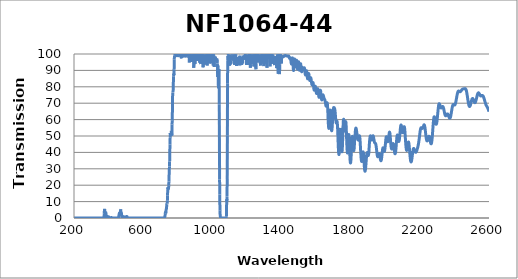
| Category | Transmission (%) |
|---|---|
| 2600.0 | 64.819 |
| 2599.0 | 65.186 |
| 2598.0 | 65.555 |
| 2597.0 | 65.883 |
| 2596.0 | 66.162 |
| 2595.0 | 66.42 |
| 2594.0 | 66.678 |
| 2593.0 | 66.877 |
| 2592.0 | 67.095 |
| 2591.0 | 67.325 |
| 2590.0 | 67.552 |
| 2589.0 | 67.796 |
| 2588.0 | 67.999 |
| 2587.0 | 68.162 |
| 2586.0 | 68.317 |
| 2585.0 | 68.507 |
| 2584.0 | 68.664 |
| 2583.0 | 68.918 |
| 2582.0 | 69.226 |
| 2581.0 | 69.512 |
| 2580.0 | 69.807 |
| 2579.0 | 70.151 |
| 2578.0 | 70.512 |
| 2577.0 | 70.845 |
| 2576.0 | 71.184 |
| 2575.0 | 71.542 |
| 2574.0 | 71.93 |
| 2573.0 | 72.319 |
| 2572.0 | 72.675 |
| 2571.0 | 73.022 |
| 2570.0 | 73.314 |
| 2569.0 | 73.608 |
| 2568.0 | 73.897 |
| 2567.0 | 74.14 |
| 2566.0 | 74.362 |
| 2565.0 | 74.49 |
| 2564.0 | 74.566 |
| 2563.0 | 74.628 |
| 2562.0 | 74.693 |
| 2561.0 | 74.696 |
| 2560.0 | 74.703 |
| 2559.0 | 74.685 |
| 2558.0 | 74.643 |
| 2557.0 | 74.584 |
| 2556.0 | 74.556 |
| 2555.0 | 74.48 |
| 2554.0 | 74.427 |
| 2553.0 | 74.418 |
| 2552.0 | 74.424 |
| 2551.0 | 74.475 |
| 2550.0 | 74.578 |
| 2549.0 | 74.709 |
| 2548.0 | 74.891 |
| 2547.0 | 75.08 |
| 2546.0 | 75.272 |
| 2545.0 | 75.492 |
| 2544.0 | 75.713 |
| 2543.0 | 75.906 |
| 2542.0 | 76.072 |
| 2541.0 | 76.221 |
| 2540.0 | 76.339 |
| 2539.0 | 76.352 |
| 2538.0 | 76.293 |
| 2537.0 | 76.152 |
| 2536.0 | 76.034 |
| 2535.0 | 75.842 |
| 2534.0 | 75.558 |
| 2533.0 | 75.249 |
| 2532.0 | 74.847 |
| 2531.0 | 74.474 |
| 2530.0 | 73.999 |
| 2529.0 | 73.49 |
| 2528.0 | 73.081 |
| 2527.0 | 72.629 |
| 2526.0 | 72.203 |
| 2525.0 | 71.814 |
| 2524.0 | 71.435 |
| 2523.0 | 71.111 |
| 2522.0 | 70.844 |
| 2521.0 | 70.589 |
| 2520.0 | 70.412 |
| 2519.0 | 70.319 |
| 2518.0 | 70.301 |
| 2517.0 | 70.356 |
| 2516.0 | 70.497 |
| 2515.0 | 70.667 |
| 2514.0 | 70.884 |
| 2513.0 | 71.127 |
| 2512.0 | 71.414 |
| 2511.0 | 71.707 |
| 2510.0 | 72.014 |
| 2509.0 | 72.284 |
| 2508.0 | 72.513 |
| 2507.0 | 72.692 |
| 2506.0 | 72.827 |
| 2505.0 | 72.874 |
| 2504.0 | 72.84 |
| 2503.0 | 72.759 |
| 2502.0 | 72.569 |
| 2501.0 | 72.298 |
| 2500.0 | 71.968 |
| 2499.0 | 71.635 |
| 2498.0 | 71.267 |
| 2497.0 | 70.84 |
| 2496.0 | 70.388 |
| 2495.0 | 69.922 |
| 2494.0 | 69.465 |
| 2493.0 | 69.022 |
| 2492.0 | 68.689 |
| 2491.0 | 68.455 |
| 2490.0 | 68.243 |
| 2489.0 | 68.086 |
| 2488.0 | 68.006 |
| 2487.0 | 68.022 |
| 2486.0 | 68.131 |
| 2485.0 | 68.337 |
| 2484.0 | 68.64 |
| 2483.0 | 69.028 |
| 2482.0 | 69.51 |
| 2481.0 | 70.027 |
| 2480.0 | 70.605 |
| 2479.0 | 71.265 |
| 2478.0 | 71.965 |
| 2477.0 | 72.663 |
| 2476.0 | 73.4 |
| 2475.0 | 74.11 |
| 2474.0 | 74.782 |
| 2473.0 | 75.445 |
| 2472.0 | 76.085 |
| 2471.0 | 76.671 |
| 2470.0 | 77.203 |
| 2469.0 | 77.634 |
| 2468.0 | 78 |
| 2467.0 | 78.272 |
| 2466.0 | 78.493 |
| 2465.0 | 78.647 |
| 2464.0 | 78.76 |
| 2463.0 | 78.844 |
| 2462.0 | 78.886 |
| 2461.0 | 78.891 |
| 2460.0 | 78.882 |
| 2459.0 | 78.859 |
| 2458.0 | 78.831 |
| 2457.0 | 78.801 |
| 2456.0 | 78.793 |
| 2455.0 | 78.766 |
| 2454.0 | 78.74 |
| 2453.0 | 78.744 |
| 2452.0 | 78.744 |
| 2451.0 | 78.732 |
| 2450.0 | 78.716 |
| 2449.0 | 78.675 |
| 2448.0 | 78.624 |
| 2447.0 | 78.556 |
| 2446.0 | 78.48 |
| 2445.0 | 78.41 |
| 2444.0 | 78.32 |
| 2443.0 | 78.2 |
| 2442.0 | 78.053 |
| 2441.0 | 77.915 |
| 2440.0 | 77.762 |
| 2439.0 | 77.594 |
| 2438.0 | 77.428 |
| 2437.0 | 77.289 |
| 2436.0 | 77.171 |
| 2435.0 | 77.075 |
| 2434.0 | 77.006 |
| 2433.0 | 76.975 |
| 2432.0 | 76.984 |
| 2431.0 | 77.02 |
| 2430.0 | 77.064 |
| 2429.0 | 77.133 |
| 2428.0 | 77.218 |
| 2427.0 | 77.297 |
| 2426.0 | 77.363 |
| 2425.0 | 77.401 |
| 2424.0 | 77.411 |
| 2423.0 | 77.366 |
| 2422.0 | 77.258 |
| 2421.0 | 77.071 |
| 2420.0 | 76.832 |
| 2419.0 | 76.56 |
| 2418.0 | 76.213 |
| 2417.0 | 75.783 |
| 2416.0 | 75.285 |
| 2415.0 | 74.745 |
| 2414.0 | 74.163 |
| 2413.0 | 73.575 |
| 2412.0 | 72.996 |
| 2411.0 | 72.394 |
| 2410.0 | 71.804 |
| 2409.0 | 71.261 |
| 2408.0 | 70.718 |
| 2407.0 | 70.236 |
| 2406.0 | 69.838 |
| 2405.0 | 69.51 |
| 2404.0 | 69.263 |
| 2403.0 | 69.066 |
| 2402.0 | 68.926 |
| 2401.0 | 68.846 |
| 2400.0 | 68.843 |
| 2399.0 | 68.908 |
| 2398.0 | 69.013 |
| 2397.0 | 69.109 |
| 2396.0 | 69.181 |
| 2395.0 | 69.226 |
| 2394.0 | 69.222 |
| 2393.0 | 69.159 |
| 2392.0 | 69.048 |
| 2391.0 | 68.865 |
| 2390.0 | 68.61 |
| 2389.0 | 68.271 |
| 2388.0 | 67.83 |
| 2387.0 | 67.295 |
| 2386.0 | 66.698 |
| 2385.0 | 66.06 |
| 2384.0 | 65.41 |
| 2383.0 | 64.742 |
| 2382.0 | 64.098 |
| 2381.0 | 63.474 |
| 2380.0 | 62.869 |
| 2379.0 | 62.323 |
| 2378.0 | 61.845 |
| 2377.0 | 61.447 |
| 2376.0 | 61.135 |
| 2375.0 | 60.935 |
| 2374.0 | 60.836 |
| 2373.0 | 60.809 |
| 2372.0 | 60.877 |
| 2371.0 | 61.003 |
| 2370.0 | 61.18 |
| 2369.0 | 61.409 |
| 2368.0 | 61.676 |
| 2367.0 | 61.979 |
| 2366.0 | 62.3 |
| 2365.0 | 62.607 |
| 2364.0 | 62.866 |
| 2363.0 | 63.094 |
| 2362.0 | 63.284 |
| 2361.0 | 63.412 |
| 2360.0 | 63.46 |
| 2359.0 | 63.458 |
| 2358.0 | 63.441 |
| 2357.0 | 63.353 |
| 2356.0 | 63.185 |
| 2355.0 | 63.002 |
| 2354.0 | 62.808 |
| 2353.0 | 62.629 |
| 2352.0 | 62.469 |
| 2351.0 | 62.379 |
| 2350.0 | 62.343 |
| 2349.0 | 62.348 |
| 2348.0 | 62.431 |
| 2347.0 | 62.603 |
| 2346.0 | 62.853 |
| 2345.0 | 63.189 |
| 2344.0 | 63.595 |
| 2343.0 | 64.076 |
| 2342.0 | 64.563 |
| 2341.0 | 65.063 |
| 2340.0 | 65.568 |
| 2339.0 | 66.084 |
| 2338.0 | 66.57 |
| 2337.0 | 66.985 |
| 2336.0 | 67.332 |
| 2335.0 | 67.628 |
| 2334.0 | 67.853 |
| 2333.0 | 67.961 |
| 2332.0 | 68.007 |
| 2331.0 | 67.968 |
| 2330.0 | 67.865 |
| 2329.0 | 67.721 |
| 2328.0 | 67.581 |
| 2327.0 | 67.446 |
| 2326.0 | 67.298 |
| 2325.0 | 67.173 |
| 2324.0 | 67.088 |
| 2323.0 | 67.092 |
| 2322.0 | 67.159 |
| 2321.0 | 67.3 |
| 2320.0 | 67.536 |
| 2319.0 | 67.848 |
| 2318.0 | 68.179 |
| 2317.0 | 68.553 |
| 2316.0 | 68.92 |
| 2315.0 | 69.244 |
| 2314.0 | 69.511 |
| 2313.0 | 69.662 |
| 2312.0 | 69.697 |
| 2311.0 | 69.585 |
| 2310.0 | 69.311 |
| 2309.0 | 68.827 |
| 2308.0 | 68.141 |
| 2307.0 | 67.315 |
| 2306.0 | 66.362 |
| 2305.0 | 65.279 |
| 2304.0 | 64.202 |
| 2303.0 | 63.066 |
| 2302.0 | 61.9 |
| 2301.0 | 60.809 |
| 2300.0 | 59.82 |
| 2299.0 | 58.946 |
| 2298.0 | 58.244 |
| 2297.0 | 57.702 |
| 2296.0 | 57.354 |
| 2295.0 | 57.173 |
| 2294.0 | 57.153 |
| 2293.0 | 57.285 |
| 2292.0 | 57.59 |
| 2291.0 | 58.022 |
| 2290.0 | 58.569 |
| 2289.0 | 59.193 |
| 2288.0 | 59.879 |
| 2287.0 | 60.48 |
| 2286.0 | 60.995 |
| 2285.0 | 61.429 |
| 2284.0 | 61.678 |
| 2283.0 | 61.697 |
| 2282.0 | 61.487 |
| 2281.0 | 61.019 |
| 2280.0 | 60.273 |
| 2279.0 | 59.287 |
| 2278.0 | 58.157 |
| 2277.0 | 56.857 |
| 2276.0 | 55.406 |
| 2275.0 | 53.91 |
| 2274.0 | 52.397 |
| 2273.0 | 50.979 |
| 2272.0 | 49.644 |
| 2271.0 | 48.457 |
| 2270.0 | 47.463 |
| 2269.0 | 46.634 |
| 2268.0 | 45.977 |
| 2267.0 | 45.558 |
| 2266.0 | 45.298 |
| 2265.0 | 45.23 |
| 2264.0 | 45.32 |
| 2263.0 | 45.573 |
| 2262.0 | 45.948 |
| 2261.0 | 46.405 |
| 2260.0 | 46.931 |
| 2259.0 | 47.506 |
| 2258.0 | 48.061 |
| 2257.0 | 48.597 |
| 2256.0 | 49.051 |
| 2255.0 | 49.42 |
| 2254.0 | 49.707 |
| 2253.0 | 49.852 |
| 2252.0 | 49.83 |
| 2251.0 | 49.704 |
| 2250.0 | 49.469 |
| 2249.0 | 49.146 |
| 2248.0 | 48.754 |
| 2247.0 | 48.34 |
| 2246.0 | 47.924 |
| 2245.0 | 47.582 |
| 2244.0 | 47.323 |
| 2243.0 | 47.099 |
| 2242.0 | 46.997 |
| 2241.0 | 47.035 |
| 2240.0 | 47.222 |
| 2239.0 | 47.569 |
| 2238.0 | 48.023 |
| 2237.0 | 48.679 |
| 2236.0 | 49.476 |
| 2235.0 | 50.312 |
| 2234.0 | 51.22 |
| 2233.0 | 52.176 |
| 2232.0 | 53.073 |
| 2231.0 | 54.026 |
| 2230.0 | 54.828 |
| 2229.0 | 55.519 |
| 2228.0 | 56.086 |
| 2227.0 | 56.477 |
| 2226.0 | 56.724 |
| 2225.0 | 56.844 |
| 2224.0 | 56.798 |
| 2223.0 | 56.605 |
| 2222.0 | 56.346 |
| 2221.0 | 56.024 |
| 2220.0 | 55.695 |
| 2219.0 | 55.371 |
| 2218.0 | 55.112 |
| 2217.0 | 54.858 |
| 2216.0 | 54.754 |
| 2215.0 | 54.658 |
| 2214.0 | 54.632 |
| 2213.0 | 54.667 |
| 2212.0 | 54.758 |
| 2211.0 | 54.882 |
| 2210.0 | 55.009 |
| 2209.0 | 55.094 |
| 2208.0 | 55.105 |
| 2207.0 | 55.017 |
| 2206.0 | 54.839 |
| 2205.0 | 54.577 |
| 2204.0 | 54.155 |
| 2203.0 | 53.618 |
| 2202.0 | 53.015 |
| 2201.0 | 52.262 |
| 2200.0 | 51.461 |
| 2199.0 | 50.591 |
| 2198.0 | 49.739 |
| 2197.0 | 48.84 |
| 2196.0 | 48.033 |
| 2195.0 | 47.205 |
| 2194.0 | 46.493 |
| 2193.0 | 45.817 |
| 2192.0 | 45.204 |
| 2191.0 | 44.623 |
| 2190.0 | 44.103 |
| 2189.0 | 43.623 |
| 2188.0 | 43.174 |
| 2187.0 | 42.755 |
| 2186.0 | 42.382 |
| 2185.0 | 42.061 |
| 2184.0 | 41.732 |
| 2183.0 | 41.391 |
| 2182.0 | 41.083 |
| 2181.0 | 40.806 |
| 2180.0 | 40.563 |
| 2179.0 | 40.363 |
| 2178.0 | 40.196 |
| 2177.0 | 40.067 |
| 2176.0 | 40.04 |
| 2175.0 | 40.05 |
| 2174.0 | 40.118 |
| 2173.0 | 40.238 |
| 2172.0 | 40.445 |
| 2171.0 | 40.729 |
| 2170.0 | 41.052 |
| 2169.0 | 41.364 |
| 2168.0 | 41.678 |
| 2167.0 | 41.944 |
| 2166.0 | 42.181 |
| 2165.0 | 42.373 |
| 2164.0 | 42.398 |
| 2163.0 | 42.271 |
| 2162.0 | 41.985 |
| 2161.0 | 41.537 |
| 2160.0 | 40.943 |
| 2159.0 | 40.245 |
| 2158.0 | 39.477 |
| 2157.0 | 38.59 |
| 2156.0 | 37.696 |
| 2155.0 | 36.844 |
| 2154.0 | 36.078 |
| 2153.0 | 35.374 |
| 2152.0 | 34.837 |
| 2151.0 | 34.429 |
| 2150.0 | 34.226 |
| 2149.0 | 34.2 |
| 2148.0 | 34.363 |
| 2147.0 | 34.743 |
| 2146.0 | 35.36 |
| 2145.0 | 36.143 |
| 2144.0 | 37.094 |
| 2143.0 | 38.211 |
| 2142.0 | 39.443 |
| 2141.0 | 40.74 |
| 2140.0 | 42.123 |
| 2139.0 | 43.321 |
| 2138.0 | 44.391 |
| 2137.0 | 45.266 |
| 2136.0 | 45.914 |
| 2135.0 | 46.28 |
| 2134.0 | 46.306 |
| 2133.0 | 46.081 |
| 2132.0 | 45.608 |
| 2131.0 | 44.975 |
| 2130.0 | 44.256 |
| 2129.0 | 43.469 |
| 2128.0 | 42.725 |
| 2127.0 | 42.079 |
| 2126.0 | 41.594 |
| 2125.0 | 41.308 |
| 2124.0 | 41.211 |
| 2123.0 | 41.386 |
| 2122.0 | 41.839 |
| 2121.0 | 42.53 |
| 2120.0 | 43.474 |
| 2119.0 | 44.659 |
| 2118.0 | 46.052 |
| 2117.0 | 47.633 |
| 2116.0 | 49.203 |
| 2115.0 | 50.813 |
| 2114.0 | 52.321 |
| 2113.0 | 53.642 |
| 2112.0 | 54.704 |
| 2111.0 | 55.366 |
| 2110.0 | 55.663 |
| 2109.0 | 55.633 |
| 2108.0 | 55.317 |
| 2107.0 | 54.817 |
| 2106.0 | 54.199 |
| 2105.0 | 53.516 |
| 2104.0 | 52.905 |
| 2103.0 | 52.424 |
| 2102.0 | 52.135 |
| 2101.0 | 52.025 |
| 2100.0 | 52.146 |
| 2099.0 | 52.506 |
| 2098.0 | 53.049 |
| 2097.0 | 53.71 |
| 2096.0 | 54.446 |
| 2095.0 | 55.178 |
| 2094.0 | 55.862 |
| 2093.0 | 56.403 |
| 2092.0 | 56.687 |
| 2091.0 | 56.698 |
| 2090.0 | 56.391 |
| 2089.0 | 55.823 |
| 2088.0 | 54.984 |
| 2087.0 | 53.927 |
| 2086.0 | 52.704 |
| 2085.0 | 51.425 |
| 2084.0 | 50.184 |
| 2083.0 | 49.05 |
| 2082.0 | 48.121 |
| 2081.0 | 47.385 |
| 2080.0 | 46.882 |
| 2079.0 | 46.67 |
| 2078.0 | 46.727 |
| 2077.0 | 46.991 |
| 2076.0 | 47.467 |
| 2075.0 | 48.101 |
| 2074.0 | 48.814 |
| 2073.0 | 49.532 |
| 2072.0 | 50.151 |
| 2071.0 | 50.529 |
| 2070.0 | 50.618 |
| 2069.0 | 50.373 |
| 2068.0 | 49.785 |
| 2067.0 | 48.915 |
| 2066.0 | 47.788 |
| 2065.0 | 46.452 |
| 2064.0 | 45.064 |
| 2063.0 | 43.687 |
| 2062.0 | 42.407 |
| 2061.0 | 41.323 |
| 2060.0 | 40.404 |
| 2059.0 | 39.714 |
| 2058.0 | 39.309 |
| 2057.0 | 39.164 |
| 2056.0 | 39.233 |
| 2055.0 | 39.529 |
| 2054.0 | 40.042 |
| 2053.0 | 40.74 |
| 2052.0 | 41.546 |
| 2051.0 | 42.396 |
| 2050.0 | 43.26 |
| 2049.0 | 44.075 |
| 2048.0 | 44.756 |
| 2047.0 | 45.183 |
| 2046.0 | 45.373 |
| 2045.0 | 45.317 |
| 2044.0 | 45.044 |
| 2043.0 | 44.602 |
| 2042.0 | 44.056 |
| 2041.0 | 43.457 |
| 2040.0 | 42.877 |
| 2039.0 | 42.407 |
| 2038.0 | 42.134 |
| 2037.0 | 42.07 |
| 2036.0 | 42.229 |
| 2035.0 | 42.654 |
| 2034.0 | 43.407 |
| 2033.0 | 44.365 |
| 2032.0 | 45.485 |
| 2031.0 | 46.776 |
| 2030.0 | 48.163 |
| 2029.0 | 49.521 |
| 2028.0 | 50.666 |
| 2027.0 | 51.564 |
| 2026.0 | 52.142 |
| 2025.0 | 52.378 |
| 2024.0 | 52.232 |
| 2023.0 | 51.72 |
| 2022.0 | 50.959 |
| 2021.0 | 50.064 |
| 2020.0 | 49.136 |
| 2019.0 | 48.27 |
| 2018.0 | 47.51 |
| 2017.0 | 46.925 |
| 2016.0 | 46.591 |
| 2015.0 | 46.493 |
| 2014.0 | 46.585 |
| 2013.0 | 46.872 |
| 2012.0 | 47.363 |
| 2011.0 | 47.936 |
| 2010.0 | 48.498 |
| 2009.0 | 49.026 |
| 2008.0 | 49.409 |
| 2007.0 | 49.563 |
| 2006.0 | 49.472 |
| 2005.0 | 49.11 |
| 2004.0 | 48.437 |
| 2003.0 | 47.496 |
| 2002.0 | 46.39 |
| 2001.0 | 45.203 |
| 2000.0 | 44.028 |
| 1999.0 | 42.994 |
| 1998.0 | 42.089 |
| 1997.0 | 41.349 |
| 1996.0 | 40.872 |
| 1995.0 | 40.657 |
| 1994.0 | 40.677 |
| 1993.0 | 40.871 |
| 1992.0 | 41.212 |
| 1991.0 | 41.647 |
| 1990.0 | 42.101 |
| 1989.0 | 42.507 |
| 1988.0 | 42.748 |
| 1987.0 | 42.785 |
| 1986.0 | 42.569 |
| 1985.0 | 42.089 |
| 1984.0 | 41.373 |
| 1983.0 | 40.477 |
| 1982.0 | 39.48 |
| 1981.0 | 38.451 |
| 1980.0 | 37.474 |
| 1979.0 | 36.602 |
| 1978.0 | 35.887 |
| 1977.0 | 35.356 |
| 1976.0 | 35.031 |
| 1975.0 | 34.907 |
| 1974.0 | 34.984 |
| 1973.0 | 35.251 |
| 1972.0 | 35.692 |
| 1971.0 | 36.23 |
| 1970.0 | 36.853 |
| 1969.0 | 37.543 |
| 1968.0 | 38.186 |
| 1967.0 | 38.691 |
| 1966.0 | 39.081 |
| 1965.0 | 39.305 |
| 1964.0 | 39.312 |
| 1963.0 | 39.128 |
| 1962.0 | 38.839 |
| 1961.0 | 38.483 |
| 1960.0 | 38.096 |
| 1959.0 | 37.761 |
| 1958.0 | 37.494 |
| 1957.0 | 37.352 |
| 1956.0 | 37.388 |
| 1955.0 | 37.641 |
| 1954.0 | 38.116 |
| 1953.0 | 38.765 |
| 1952.0 | 39.555 |
| 1951.0 | 40.463 |
| 1950.0 | 41.405 |
| 1949.0 | 42.395 |
| 1948.0 | 43.29 |
| 1947.0 | 44.03 |
| 1946.0 | 44.625 |
| 1945.0 | 45.104 |
| 1944.0 | 45.387 |
| 1943.0 | 45.541 |
| 1942.0 | 45.632 |
| 1941.0 | 45.685 |
| 1940.0 | 45.746 |
| 1939.0 | 45.855 |
| 1938.0 | 46.1 |
| 1937.0 | 46.467 |
| 1936.0 | 46.965 |
| 1935.0 | 47.565 |
| 1934.0 | 48.212 |
| 1933.0 | 48.843 |
| 1932.0 | 49.426 |
| 1931.0 | 49.893 |
| 1930.0 | 50.146 |
| 1929.0 | 50.15 |
| 1928.0 | 50.006 |
| 1927.0 | 49.693 |
| 1926.0 | 49.246 |
| 1925.0 | 48.76 |
| 1924.0 | 48.316 |
| 1923.0 | 47.929 |
| 1922.0 | 47.622 |
| 1921.0 | 47.496 |
| 1920.0 | 47.574 |
| 1919.0 | 47.83 |
| 1918.0 | 48.297 |
| 1917.0 | 48.886 |
| 1916.0 | 49.488 |
| 1915.0 | 49.95 |
| 1914.0 | 50.134 |
| 1913.0 | 49.932 |
| 1912.0 | 49.351 |
| 1911.0 | 48.535 |
| 1910.0 | 47.563 |
| 1909.0 | 46.385 |
| 1908.0 | 44.963 |
| 1907.0 | 43.269 |
| 1906.0 | 41.473 |
| 1905.0 | 40.005 |
| 1904.0 | 38.984 |
| 1903.0 | 38.363 |
| 1902.0 | 38.103 |
| 1901.0 | 38.058 |
| 1900.0 | 38.253 |
| 1899.0 | 38.566 |
| 1898.0 | 38.936 |
| 1897.0 | 39.393 |
| 1896.0 | 39.751 |
| 1895.0 | 39.902 |
| 1894.0 | 39.718 |
| 1893.0 | 39.113 |
| 1892.0 | 37.954 |
| 1891.0 | 36.584 |
| 1890.0 | 35.138 |
| 1889.0 | 33.636 |
| 1888.0 | 32.341 |
| 1887.0 | 31.189 |
| 1886.0 | 30.175 |
| 1885.0 | 29.281 |
| 1884.0 | 28.68 |
| 1883.0 | 28.493 |
| 1882.0 | 28.692 |
| 1881.0 | 29.311 |
| 1880.0 | 30.289 |
| 1879.0 | 31.529 |
| 1878.0 | 33.203 |
| 1877.0 | 34.893 |
| 1876.0 | 36.587 |
| 1875.0 | 38.166 |
| 1874.0 | 39.424 |
| 1873.0 | 40.089 |
| 1872.0 | 40.334 |
| 1871.0 | 40.049 |
| 1870.0 | 39.191 |
| 1869.0 | 38.099 |
| 1868.0 | 36.932 |
| 1867.0 | 35.939 |
| 1866.0 | 35.167 |
| 1865.0 | 34.691 |
| 1864.0 | 34.477 |
| 1863.0 | 34.582 |
| 1862.0 | 35.106 |
| 1861.0 | 35.957 |
| 1860.0 | 37.185 |
| 1859.0 | 38.779 |
| 1858.0 | 40.508 |
| 1857.0 | 42.438 |
| 1856.0 | 44.419 |
| 1855.0 | 46.245 |
| 1854.0 | 47.848 |
| 1853.0 | 48.962 |
| 1852.0 | 49.752 |
| 1851.0 | 50.12 |
| 1850.0 | 50.13 |
| 1849.0 | 49.779 |
| 1848.0 | 49.006 |
| 1847.0 | 48.173 |
| 1846.0 | 47.657 |
| 1845.0 | 47.439 |
| 1844.0 | 47.491 |
| 1843.0 | 47.726 |
| 1842.0 | 48.037 |
| 1841.0 | 48.227 |
| 1840.0 | 48.658 |
| 1839.0 | 49.287 |
| 1838.0 | 50.05 |
| 1837.0 | 50.916 |
| 1836.0 | 51.724 |
| 1835.0 | 52.469 |
| 1834.0 | 53.185 |
| 1833.0 | 53.835 |
| 1832.0 | 54.443 |
| 1831.0 | 54.73 |
| 1830.0 | 54.792 |
| 1829.0 | 54.52 |
| 1828.0 | 53.93 |
| 1827.0 | 52.884 |
| 1826.0 | 51.468 |
| 1825.0 | 50.067 |
| 1824.0 | 48.608 |
| 1823.0 | 47.092 |
| 1822.0 | 45.327 |
| 1821.0 | 43.524 |
| 1820.0 | 42.103 |
| 1819.0 | 41.336 |
| 1818.0 | 41.1 |
| 1817.0 | 41.306 |
| 1816.0 | 41.89 |
| 1815.0 | 42.831 |
| 1814.0 | 44.053 |
| 1813.0 | 45.535 |
| 1812.0 | 47.145 |
| 1811.0 | 48.531 |
| 1810.0 | 49.499 |
| 1809.0 | 49.767 |
| 1808.0 | 49.209 |
| 1807.0 | 47.814 |
| 1806.0 | 45.675 |
| 1805.0 | 43.204 |
| 1804.0 | 40.66 |
| 1803.0 | 38.307 |
| 1802.0 | 36.269 |
| 1801.0 | 34.816 |
| 1800.0 | 33.836 |
| 1799.0 | 33.52 |
| 1798.0 | 33.877 |
| 1797.0 | 34.934 |
| 1796.0 | 36.567 |
| 1795.0 | 38.819 |
| 1794.0 | 41.548 |
| 1793.0 | 44.456 |
| 1792.0 | 47.331 |
| 1791.0 | 49.507 |
| 1790.0 | 50.735 |
| 1789.0 | 50.776 |
| 1788.0 | 49.69 |
| 1787.0 | 47.856 |
| 1786.0 | 45.599 |
| 1785.0 | 43.425 |
| 1784.0 | 41.451 |
| 1783.0 | 40.26 |
| 1782.0 | 39.671 |
| 1781.0 | 39.803 |
| 1780.0 | 40.695 |
| 1779.0 | 42.294 |
| 1778.0 | 44.582 |
| 1777.0 | 47.245 |
| 1776.0 | 50.251 |
| 1775.0 | 53.277 |
| 1774.0 | 55.905 |
| 1773.0 | 57.732 |
| 1772.0 | 58.665 |
| 1771.0 | 58.635 |
| 1770.0 | 57.812 |
| 1769.0 | 56.5 |
| 1768.0 | 55.094 |
| 1767.0 | 53.926 |
| 1766.0 | 53.19 |
| 1765.0 | 53.126 |
| 1764.0 | 53.752 |
| 1763.0 | 55.022 |
| 1762.0 | 56.646 |
| 1761.0 | 58.359 |
| 1760.0 | 59.76 |
| 1759.0 | 60.243 |
| 1758.0 | 59.661 |
| 1757.0 | 57.939 |
| 1756.0 | 55.247 |
| 1755.0 | 51.901 |
| 1754.0 | 48.527 |
| 1753.0 | 45.48 |
| 1752.0 | 42.989 |
| 1751.0 | 41.334 |
| 1750.0 | 40.457 |
| 1749.0 | 40.456 |
| 1748.0 | 41.299 |
| 1747.0 | 42.898 |
| 1746.0 | 45.196 |
| 1745.0 | 47.865 |
| 1744.0 | 50.707 |
| 1743.0 | 53.093 |
| 1742.0 | 54.603 |
| 1741.0 | 54.92 |
| 1740.0 | 53.906 |
| 1739.0 | 51.846 |
| 1738.0 | 49.146 |
| 1737.0 | 46.256 |
| 1736.0 | 43.597 |
| 1735.0 | 41.374 |
| 1734.0 | 39.776 |
| 1733.0 | 38.879 |
| 1732.0 | 38.735 |
| 1731.0 | 39.246 |
| 1730.0 | 40.45 |
| 1729.0 | 42.324 |
| 1728.0 | 44.744 |
| 1727.0 | 47.553 |
| 1726.0 | 50.552 |
| 1725.0 | 53.349 |
| 1724.0 | 55.795 |
| 1723.0 | 57.589 |
| 1722.0 | 58.642 |
| 1721.0 | 58.979 |
| 1720.0 | 58.822 |
| 1719.0 | 58.416 |
| 1718.0 | 58.012 |
| 1717.0 | 57.847 |
| 1716.0 | 58.057 |
| 1715.0 | 58.675 |
| 1714.0 | 59.641 |
| 1713.0 | 60.842 |
| 1712.0 | 62.212 |
| 1711.0 | 63.533 |
| 1710.0 | 64.732 |
| 1709.0 | 65.697 |
| 1708.0 | 66.364 |
| 1707.0 | 66.787 |
| 1706.0 | 67.034 |
| 1705.0 | 67.19 |
| 1704.0 | 67.288 |
| 1703.0 | 67.363 |
| 1702.0 | 67.352 |
| 1701.0 | 67.157 |
| 1700.0 | 66.676 |
| 1699.0 | 65.815 |
| 1698.0 | 64.532 |
| 1697.0 | 62.904 |
| 1696.0 | 61.011 |
| 1695.0 | 58.979 |
| 1694.0 | 57.02 |
| 1693.0 | 55.325 |
| 1692.0 | 54.104 |
| 1691.0 | 53.361 |
| 1690.0 | 53.21 |
| 1689.0 | 53.714 |
| 1688.0 | 54.869 |
| 1687.0 | 56.601 |
| 1686.0 | 58.764 |
| 1685.0 | 61.079 |
| 1684.0 | 63.252 |
| 1683.0 | 64.904 |
| 1682.0 | 65.752 |
| 1681.0 | 65.622 |
| 1680.0 | 64.488 |
| 1679.0 | 62.658 |
| 1678.0 | 60.437 |
| 1677.0 | 58.258 |
| 1676.0 | 56.422 |
| 1675.0 | 55.172 |
| 1674.0 | 54.641 |
| 1673.0 | 54.87 |
| 1672.0 | 55.824 |
| 1671.0 | 57.416 |
| 1670.0 | 59.56 |
| 1669.0 | 62.096 |
| 1668.0 | 64.651 |
| 1667.0 | 66.86 |
| 1666.0 | 68.645 |
| 1665.0 | 69.772 |
| 1664.0 | 70.255 |
| 1663.0 | 70.161 |
| 1662.0 | 69.71 |
| 1661.0 | 69.127 |
| 1660.0 | 68.588 |
| 1659.0 | 68.248 |
| 1658.0 | 68.18 |
| 1657.0 | 68.39 |
| 1656.0 | 68.867 |
| 1655.0 | 69.523 |
| 1654.0 | 70.218 |
| 1653.0 | 70.873 |
| 1652.0 | 71.442 |
| 1651.0 | 71.888 |
| 1650.0 | 72.17 |
| 1649.0 | 72.362 |
| 1648.0 | 72.523 |
| 1647.0 | 72.725 |
| 1646.0 | 72.997 |
| 1645.0 | 73.36 |
| 1644.0 | 73.81 |
| 1643.0 | 74.271 |
| 1642.0 | 74.674 |
| 1641.0 | 74.962 |
| 1640.0 | 75.057 |
| 1639.0 | 74.88 |
| 1638.0 | 74.434 |
| 1637.0 | 73.805 |
| 1636.0 | 73.121 |
| 1635.0 | 72.515 |
| 1634.0 | 72.112 |
| 1633.0 | 72.02 |
| 1632.0 | 72.267 |
| 1631.0 | 72.853 |
| 1630.0 | 73.747 |
| 1629.0 | 74.815 |
| 1628.0 | 75.915 |
| 1627.0 | 76.918 |
| 1626.0 | 77.627 |
| 1625.0 | 77.912 |
| 1624.0 | 77.773 |
| 1623.0 | 77.265 |
| 1622.0 | 76.468 |
| 1621.0 | 75.543 |
| 1620.0 | 74.665 |
| 1619.0 | 73.977 |
| 1618.0 | 73.602 |
| 1617.0 | 73.599 |
| 1616.0 | 73.97 |
| 1615.0 | 74.662 |
| 1614.0 | 75.574 |
| 1613.0 | 76.589 |
| 1612.0 | 77.545 |
| 1611.0 | 78.298 |
| 1610.0 | 78.752 |
| 1609.0 | 78.855 |
| 1608.0 | 78.589 |
| 1607.0 | 78.027 |
| 1606.0 | 77.361 |
| 1605.0 | 76.695 |
| 1604.0 | 76.161 |
| 1603.0 | 75.916 |
| 1602.0 | 75.999 |
| 1601.0 | 76.451 |
| 1600.0 | 77.177 |
| 1599.0 | 78.073 |
| 1598.0 | 78.974 |
| 1597.0 | 79.727 |
| 1596.0 | 80.215 |
| 1595.0 | 80.323 |
| 1594.0 | 80.089 |
| 1593.0 | 79.573 |
| 1592.0 | 78.95 |
| 1591.0 | 78.376 |
| 1590.0 | 78.014 |
| 1589.0 | 77.972 |
| 1588.0 | 78.274 |
| 1587.0 | 78.939 |
| 1586.0 | 79.829 |
| 1585.0 | 80.782 |
| 1584.0 | 81.675 |
| 1583.0 | 82.287 |
| 1582.0 | 82.594 |
| 1581.0 | 82.583 |
| 1580.0 | 82.3 |
| 1579.0 | 81.902 |
| 1578.0 | 81.494 |
| 1577.0 | 81.255 |
| 1576.0 | 81.306 |
| 1575.0 | 81.687 |
| 1574.0 | 82.337 |
| 1573.0 | 83.197 |
| 1572.0 | 84.076 |
| 1571.0 | 84.856 |
| 1570.0 | 85.384 |
| 1569.0 | 85.563 |
| 1568.0 | 85.403 |
| 1567.0 | 84.995 |
| 1566.0 | 84.463 |
| 1565.0 | 84.035 |
| 1564.0 | 83.842 |
| 1563.0 | 83.974 |
| 1562.0 | 84.493 |
| 1561.0 | 85.326 |
| 1560.0 | 86.297 |
| 1559.0 | 87.243 |
| 1558.0 | 87.917 |
| 1557.0 | 88.105 |
| 1556.0 | 87.859 |
| 1555.0 | 87.193 |
| 1554.0 | 86.351 |
| 1553.0 | 85.519 |
| 1552.0 | 84.967 |
| 1551.0 | 84.863 |
| 1550.0 | 85.262 |
| 1549.0 | 86.073 |
| 1548.0 | 87.131 |
| 1547.0 | 88.255 |
| 1546.0 | 89.178 |
| 1545.0 | 89.721 |
| 1544.0 | 89.777 |
| 1543.0 | 89.376 |
| 1542.0 | 88.686 |
| 1541.0 | 87.928 |
| 1540.0 | 87.356 |
| 1539.0 | 87.139 |
| 1538.0 | 87.33 |
| 1537.0 | 87.944 |
| 1536.0 | 88.812 |
| 1535.0 | 89.808 |
| 1534.0 | 90.693 |
| 1533.0 | 91.316 |
| 1532.0 | 91.576 |
| 1531.0 | 91.481 |
| 1530.0 | 91.177 |
| 1529.0 | 90.761 |
| 1528.0 | 90.433 |
| 1527.0 | 90.291 |
| 1526.0 | 90.433 |
| 1525.0 | 90.784 |
| 1524.0 | 91.237 |
| 1523.0 | 91.596 |
| 1522.0 | 91.708 |
| 1521.0 | 91.477 |
| 1520.0 | 90.925 |
| 1519.0 | 90.214 |
| 1518.0 | 89.534 |
| 1517.0 | 89.204 |
| 1516.0 | 89.29 |
| 1515.0 | 89.882 |
| 1514.0 | 90.876 |
| 1513.0 | 92.159 |
| 1512.0 | 93.238 |
| 1511.0 | 93.954 |
| 1510.0 | 94.096 |
| 1509.0 | 93.586 |
| 1508.0 | 92.688 |
| 1507.0 | 91.488 |
| 1506.0 | 90.572 |
| 1505.0 | 90.061 |
| 1504.0 | 90.181 |
| 1503.0 | 90.914 |
| 1502.0 | 92.063 |
| 1501.0 | 93.43 |
| 1500.0 | 94.586 |
| 1499.0 | 95.208 |
| 1498.0 | 95.15 |
| 1497.0 | 94.425 |
| 1496.0 | 93.294 |
| 1495.0 | 92.08 |
| 1494.0 | 91.157 |
| 1493.0 | 90.741 |
| 1492.0 | 90.919 |
| 1491.0 | 91.775 |
| 1490.0 | 93.037 |
| 1489.0 | 94.455 |
| 1488.0 | 95.607 |
| 1487.0 | 96.201 |
| 1486.0 | 96.099 |
| 1485.0 | 95.298 |
| 1484.0 | 94.168 |
| 1483.0 | 93.079 |
| 1482.0 | 92.356 |
| 1481.0 | 92.264 |
| 1480.0 | 92.871 |
| 1479.0 | 94.003 |
| 1478.0 | 95.347 |
| 1477.0 | 96.452 |
| 1476.0 | 96.941 |
| 1475.0 | 96.581 |
| 1474.0 | 95.384 |
| 1473.0 | 93.7 |
| 1472.0 | 92.016 |
| 1471.0 | 90.617 |
| 1470.0 | 89.948 |
| 1469.0 | 90.252 |
| 1468.0 | 91.319 |
| 1467.0 | 93.029 |
| 1466.0 | 94.785 |
| 1465.0 | 96.367 |
| 1464.0 | 97.382 |
| 1463.0 | 97.618 |
| 1462.0 | 97.151 |
| 1461.0 | 96.283 |
| 1460.0 | 95.25 |
| 1459.0 | 94.4 |
| 1458.0 | 93.904 |
| 1457.0 | 94.024 |
| 1456.0 | 94.503 |
| 1455.0 | 95.268 |
| 1454.0 | 96.127 |
| 1453.0 | 96.876 |
| 1452.0 | 97.448 |
| 1451.0 | 97.688 |
| 1450.0 | 97.733 |
| 1449.0 | 97.614 |
| 1448.0 | 97.44 |
| 1447.0 | 97.344 |
| 1446.0 | 97.455 |
| 1445.0 | 97.713 |
| 1444.0 | 98.06 |
| 1443.0 | 98.38 |
| 1442.0 | 98.684 |
| 1441.0 | 98.833 |
| 1440.0 | 98.827 |
| 1439.0 | 98.829 |
| 1438.0 | 98.711 |
| 1437.0 | 98.656 |
| 1436.0 | 98.632 |
| 1435.0 | 98.703 |
| 1434.0 | 98.786 |
| 1433.0 | 98.85 |
| 1432.0 | 98.876 |
| 1431.0 | 98.907 |
| 1430.0 | 98.878 |
| 1429.0 | 98.848 |
| 1428.0 | 98.847 |
| 1427.0 | 98.891 |
| 1426.0 | 98.914 |
| 1425.0 | 98.992 |
| 1424.0 | 99.025 |
| 1423.0 | 99.064 |
| 1422.0 | 99.061 |
| 1421.0 | 99.055 |
| 1420.0 | 99.03 |
| 1419.0 | 98.922 |
| 1418.0 | 98.927 |
| 1417.0 | 98.921 |
| 1416.0 | 98.894 |
| 1415.0 | 98.794 |
| 1414.0 | 98.723 |
| 1413.0 | 98.527 |
| 1412.0 | 98.446 |
| 1411.0 | 98.346 |
| 1410.0 | 98.263 |
| 1409.0 | 98.302 |
| 1408.0 | 98.313 |
| 1407.0 | 98.339 |
| 1406.0 | 98.356 |
| 1405.0 | 98.316 |
| 1404.0 | 98.303 |
| 1403.0 | 98.296 |
| 1402.0 | 98.135 |
| 1401.0 | 97.921 |
| 1400.0 | 95.159 |
| 1399.0 | 94.216 |
| 1398.0 | 99.574 |
| 1397.0 | 99.254 |
| 1396.0 | 97.972 |
| 1395.0 | 95.397 |
| 1394.0 | 95.071 |
| 1393.0 | 100 |
| 1392.0 | 97.748 |
| 1391.0 | 98.811 |
| 1390.0 | 93.768 |
| 1389.0 | 89.222 |
| 1388.0 | 87.731 |
| 1387.0 | 89.371 |
| 1386.0 | 93.649 |
| 1385.0 | 99.001 |
| 1384.0 | 99.832 |
| 1383.0 | 98.227 |
| 1382.0 | 93.32 |
| 1381.0 | 88.001 |
| 1380.0 | 93.11 |
| 1379.0 | 95.975 |
| 1378.0 | 97.266 |
| 1377.0 | 99.56 |
| 1376.0 | 99.748 |
| 1375.0 | 99.08 |
| 1374.0 | 96.814 |
| 1373.0 | 94.229 |
| 1372.0 | 91.379 |
| 1371.0 | 92.403 |
| 1370.0 | 94.017 |
| 1369.0 | 95.165 |
| 1368.0 | 98.76 |
| 1367.0 | 96.071 |
| 1366.0 | 97.812 |
| 1365.0 | 97.225 |
| 1364.0 | 98.336 |
| 1363.0 | 98.642 |
| 1362.0 | 96.951 |
| 1361.0 | 98.028 |
| 1360.0 | 93.231 |
| 1359.0 | 93.71 |
| 1358.0 | 97.167 |
| 1357.0 | 95.88 |
| 1356.0 | 96.651 |
| 1355.0 | 97.09 |
| 1354.0 | 94.153 |
| 1353.0 | 95.01 |
| 1352.0 | 98.959 |
| 1351.0 | 99.657 |
| 1350.0 | 99.433 |
| 1349.0 | 99.268 |
| 1348.0 | 99.23 |
| 1347.0 | 99.81 |
| 1346.0 | 99.337 |
| 1345.0 | 99.913 |
| 1344.0 | 98.405 |
| 1343.0 | 94.225 |
| 1342.0 | 99.861 |
| 1341.0 | 99.922 |
| 1340.0 | 99.441 |
| 1339.0 | 98.339 |
| 1338.0 | 99.432 |
| 1337.0 | 99.932 |
| 1336.0 | 93.889 |
| 1335.0 | 92.971 |
| 1334.0 | 92.466 |
| 1333.0 | 93.519 |
| 1332.0 | 99.857 |
| 1331.0 | 97.088 |
| 1330.0 | 96.669 |
| 1329.0 | 98.885 |
| 1328.0 | 97.809 |
| 1327.0 | 99.969 |
| 1326.0 | 99.427 |
| 1325.0 | 98.967 |
| 1324.0 | 99.681 |
| 1323.0 | 99.444 |
| 1322.0 | 99.422 |
| 1321.0 | 98.446 |
| 1320.0 | 99.739 |
| 1319.0 | 98.721 |
| 1318.0 | 96.679 |
| 1317.0 | 92.712 |
| 1316.0 | 91.606 |
| 1315.0 | 93.197 |
| 1314.0 | 96.323 |
| 1313.0 | 99.218 |
| 1312.0 | 98.254 |
| 1311.0 | 98.768 |
| 1310.0 | 99.866 |
| 1309.0 | 98.61 |
| 1308.0 | 94.473 |
| 1307.0 | 94.009 |
| 1306.0 | 99.639 |
| 1305.0 | 98.877 |
| 1304.0 | 99.477 |
| 1303.0 | 99.163 |
| 1302.0 | 99.458 |
| 1301.0 | 99.663 |
| 1300.0 | 99.69 |
| 1299.0 | 94.462 |
| 1298.0 | 92.619 |
| 1297.0 | 94.739 |
| 1296.0 | 99.14 |
| 1295.0 | 98.27 |
| 1294.0 | 98.41 |
| 1293.0 | 98.847 |
| 1292.0 | 98.871 |
| 1291.0 | 94.259 |
| 1290.0 | 94.874 |
| 1289.0 | 99.856 |
| 1288.0 | 97.594 |
| 1287.0 | 98.493 |
| 1286.0 | 99.797 |
| 1285.0 | 98.572 |
| 1284.0 | 99.385 |
| 1283.0 | 98.559 |
| 1282.0 | 97.757 |
| 1281.0 | 99.278 |
| 1280.0 | 96.598 |
| 1279.0 | 92.971 |
| 1278.0 | 93.589 |
| 1277.0 | 95.492 |
| 1276.0 | 99.504 |
| 1275.0 | 98.775 |
| 1274.0 | 98.93 |
| 1273.0 | 99.2 |
| 1272.0 | 97.867 |
| 1271.0 | 99.367 |
| 1270.0 | 99.129 |
| 1269.0 | 99.648 |
| 1268.0 | 97.946 |
| 1267.0 | 98.688 |
| 1266.0 | 96.84 |
| 1265.0 | 94.821 |
| 1264.0 | 98.619 |
| 1263.0 | 98.475 |
| 1262.0 | 99.845 |
| 1261.0 | 98.467 |
| 1260.0 | 98.654 |
| 1259.0 | 99.812 |
| 1258.0 | 99.563 |
| 1257.0 | 99.646 |
| 1256.0 | 99.578 |
| 1255.0 | 99.95 |
| 1254.0 | 98.495 |
| 1253.0 | 95.413 |
| 1252.0 | 90.684 |
| 1251.0 | 91.095 |
| 1250.0 | 95.778 |
| 1249.0 | 98.369 |
| 1248.0 | 98.102 |
| 1247.0 | 99.371 |
| 1246.0 | 99.904 |
| 1245.0 | 99.735 |
| 1244.0 | 99.935 |
| 1243.0 | 99.546 |
| 1242.0 | 97.774 |
| 1241.0 | 93.581 |
| 1240.0 | 92.426 |
| 1239.0 | 95.017 |
| 1238.0 | 99.779 |
| 1237.0 | 99.182 |
| 1236.0 | 98.64 |
| 1235.0 | 97.853 |
| 1234.0 | 98.043 |
| 1233.0 | 99.243 |
| 1232.0 | 98.481 |
| 1231.0 | 97.843 |
| 1230.0 | 98.194 |
| 1229.0 | 98.813 |
| 1228.0 | 96.912 |
| 1227.0 | 94.096 |
| 1226.0 | 96.587 |
| 1225.0 | 99.183 |
| 1224.0 | 98.749 |
| 1223.0 | 99.107 |
| 1222.0 | 98.26 |
| 1221.0 | 93.507 |
| 1220.0 | 91.636 |
| 1219.0 | 95.667 |
| 1218.0 | 99.887 |
| 1217.0 | 99.461 |
| 1216.0 | 98.955 |
| 1215.0 | 99.676 |
| 1214.0 | 99.985 |
| 1213.0 | 99.233 |
| 1212.0 | 99.763 |
| 1211.0 | 99.445 |
| 1210.0 | 96.89 |
| 1209.0 | 98.876 |
| 1208.0 | 95.73 |
| 1207.0 | 96.481 |
| 1206.0 | 97.453 |
| 1205.0 | 97.892 |
| 1204.0 | 93.383 |
| 1203.0 | 94.641 |
| 1202.0 | 98.844 |
| 1201.0 | 99.428 |
| 1200.0 | 98.678 |
| 1199.0 | 96.95 |
| 1198.0 | 93.302 |
| 1197.0 | 96.868 |
| 1196.0 | 99.415 |
| 1195.0 | 99.861 |
| 1194.0 | 99.806 |
| 1193.0 | 99.55 |
| 1192.0 | 99.393 |
| 1191.0 | 99.94 |
| 1190.0 | 97.047 |
| 1189.0 | 96.838 |
| 1188.0 | 99.001 |
| 1187.0 | 97.916 |
| 1186.0 | 96.467 |
| 1185.0 | 97.667 |
| 1184.0 | 98.322 |
| 1183.0 | 98.139 |
| 1182.0 | 97.104 |
| 1181.0 | 97.409 |
| 1180.0 | 98.953 |
| 1179.0 | 98.919 |
| 1178.0 | 98.522 |
| 1177.0 | 97.627 |
| 1176.0 | 94.164 |
| 1175.0 | 94.455 |
| 1174.0 | 95.985 |
| 1173.0 | 96.249 |
| 1172.0 | 98.163 |
| 1171.0 | 95.846 |
| 1170.0 | 93.31 |
| 1169.0 | 93.374 |
| 1168.0 | 94.334 |
| 1167.0 | 95.494 |
| 1166.0 | 95.941 |
| 1165.0 | 97.079 |
| 1164.0 | 95.856 |
| 1163.0 | 94.779 |
| 1162.0 | 96.146 |
| 1161.0 | 97.709 |
| 1160.0 | 98.966 |
| 1159.0 | 98.961 |
| 1158.0 | 96.522 |
| 1157.0 | 93.059 |
| 1156.0 | 95.482 |
| 1155.0 | 96.997 |
| 1154.0 | 98.268 |
| 1153.0 | 95.712 |
| 1152.0 | 94.455 |
| 1151.0 | 94.887 |
| 1150.0 | 95.558 |
| 1149.0 | 95.593 |
| 1148.0 | 95.263 |
| 1147.0 | 96.574 |
| 1146.0 | 98.188 |
| 1145.0 | 94.876 |
| 1144.0 | 95.439 |
| 1143.0 | 96.097 |
| 1142.0 | 96.021 |
| 1141.0 | 96.911 |
| 1140.0 | 92.752 |
| 1139.0 | 93.904 |
| 1138.0 | 95.367 |
| 1137.0 | 97.324 |
| 1136.0 | 98.061 |
| 1135.0 | 99.756 |
| 1134.0 | 97.532 |
| 1133.0 | 97.178 |
| 1132.0 | 97.62 |
| 1131.0 | 97.475 |
| 1130.0 | 95.505 |
| 1129.0 | 93.341 |
| 1128.0 | 99.749 |
| 1127.0 | 95.76 |
| 1126.0 | 94.144 |
| 1125.0 | 95.427 |
| 1124.0 | 97.821 |
| 1123.0 | 97.739 |
| 1122.0 | 97.683 |
| 1121.0 | 98.256 |
| 1120.0 | 98.181 |
| 1119.0 | 96.9 |
| 1118.0 | 96.058 |
| 1117.0 | 96.878 |
| 1116.0 | 97.17 |
| 1115.0 | 98.93 |
| 1114.0 | 99.766 |
| 1113.0 | 99.118 |
| 1112.0 | 97.985 |
| 1111.0 | 96.634 |
| 1110.0 | 96.76 |
| 1109.0 | 98.066 |
| 1108.0 | 96.259 |
| 1107.0 | 95.994 |
| 1106.0 | 95.062 |
| 1105.0 | 94.173 |
| 1104.0 | 93.986 |
| 1103.0 | 94.801 |
| 1102.0 | 97.209 |
| 1101.0 | 98.045 |
| 1100.0 | 99.153 |
| 1099.0 | 94.899 |
| 1098.0 | 92.868 |
| 1097.0 | 99.706 |
| 1096.0 | 95.238 |
| 1095.0 | 95.735 |
| 1094.0 | 97.59 |
| 1093.0 | 97.874 |
| 1092.0 | 98.241 |
| 1091.0 | 99.201 |
| 1090.0 | 98.977 |
| 1089.0 | 96.013 |
| 1088.0 | 81.838 |
| 1087.0 | 50.186 |
| 1086.0 | 23.766 |
| 1085.0 | 13.056 |
| 1084.0 | 10.488 |
| 1083.0 | 11.436 |
| 1082.0 | 0.984 |
| 1081.0 | 0.622 |
| 1080.0 | 0.041 |
| 1079.0 | 0.011 |
| 1078.0 | 0.002 |
| 1077.0 | 0 |
| 1076.0 | 0 |
| 1075.0 | 0 |
| 1074.0 | 0 |
| 1073.0 | 0 |
| 1072.0 | 0 |
| 1071.0 | 0 |
| 1070.0 | 0 |
| 1069.0 | 0 |
| 1068.0 | 0 |
| 1067.0 | 0 |
| 1066.0 | 0 |
| 1065.0 | 0 |
| 1064.0 | 0 |
| 1063.0 | 0 |
| 1062.0 | 0 |
| 1061.0 | 0 |
| 1060.0 | 0 |
| 1059.0 | 0 |
| 1058.0 | 0 |
| 1057.0 | 0 |
| 1056.0 | 0 |
| 1055.0 | 0 |
| 1054.0 | 0.001 |
| 1053.0 | 0.001 |
| 1052.0 | 0.003 |
| 1051.0 | 0.009 |
| 1050.0 | 0.023 |
| 1049.0 | 0.036 |
| 1048.0 | 0.066 |
| 1047.0 | 0.37 |
| 1046.0 | 1.235 |
| 1045.0 | 2.274 |
| 1044.0 | 4.482 |
| 1043.0 | 14.31 |
| 1042.0 | 23.491 |
| 1041.0 | 47.003 |
| 1040.0 | 69.017 |
| 1039.0 | 85.745 |
| 1038.0 | 90.757 |
| 1037.0 | 84.948 |
| 1036.0 | 79.108 |
| 1035.0 | 80.353 |
| 1034.0 | 89.8 |
| 1033.0 | 91.732 |
| 1032.0 | 92.967 |
| 1031.0 | 85.958 |
| 1030.0 | 91.375 |
| 1029.0 | 94.205 |
| 1028.0 | 96.625 |
| 1027.0 | 97.089 |
| 1026.0 | 97.072 |
| 1025.0 | 95.347 |
| 1024.0 | 96.031 |
| 1023.0 | 96.419 |
| 1022.0 | 96.791 |
| 1021.0 | 97.388 |
| 1020.0 | 96.455 |
| 1019.0 | 97.657 |
| 1018.0 | 97.904 |
| 1017.0 | 96.447 |
| 1016.0 | 98.47 |
| 1015.0 | 95.961 |
| 1014.0 | 98.258 |
| 1013.0 | 98.288 |
| 1012.0 | 96.42 |
| 1011.0 | 92.034 |
| 1010.0 | 98.283 |
| 1009.0 | 98.792 |
| 1008.0 | 99.233 |
| 1007.0 | 99.437 |
| 1006.0 | 99.732 |
| 1005.0 | 92.987 |
| 1004.0 | 98.244 |
| 1003.0 | 99.266 |
| 1002.0 | 99.452 |
| 1001.0 | 99.315 |
| 1000.0 | 99.171 |
| 999.0 | 96.007 |
| 998.0 | 98.96 |
| 997.0 | 99.656 |
| 996.0 | 98.259 |
| 995.0 | 94.401 |
| 994.0 | 98.925 |
| 993.0 | 98.602 |
| 992.0 | 98.649 |
| 991.0 | 99.863 |
| 990.0 | 94.913 |
| 989.0 | 96.501 |
| 988.0 | 99.241 |
| 987.0 | 99.119 |
| 986.0 | 98.812 |
| 985.0 | 94.153 |
| 984.0 | 98.367 |
| 983.0 | 99.315 |
| 982.0 | 99.295 |
| 981.0 | 94.975 |
| 980.0 | 99.973 |
| 979.0 | 98.324 |
| 978.0 | 99.483 |
| 977.0 | 94.512 |
| 976.0 | 96.915 |
| 975.0 | 99.325 |
| 974.0 | 95.619 |
| 973.0 | 98.399 |
| 972.0 | 99.792 |
| 971.0 | 98.259 |
| 970.0 | 92.964 |
| 969.0 | 97.686 |
| 968.0 | 99.127 |
| 967.0 | 99.562 |
| 966.0 | 99.62 |
| 965.0 | 99.402 |
| 964.0 | 94.179 |
| 963.0 | 94.697 |
| 962.0 | 98.006 |
| 961.0 | 94.261 |
| 960.0 | 99.572 |
| 959.0 | 93.586 |
| 958.0 | 94.085 |
| 957.0 | 99.212 |
| 956.0 | 94.593 |
| 955.0 | 99.732 |
| 954.0 | 94.621 |
| 953.0 | 98.868 |
| 952.0 | 99.165 |
| 951.0 | 95.993 |
| 950.0 | 99.593 |
| 949.0 | 95.952 |
| 948.0 | 99.023 |
| 947.0 | 92.03 |
| 946.0 | 91.837 |
| 945.0 | 98.785 |
| 944.0 | 99.304 |
| 943.0 | 98.786 |
| 942.0 | 99.814 |
| 941.0 | 98.237 |
| 940.0 | 94.669 |
| 939.0 | 98.577 |
| 938.0 | 99.893 |
| 937.0 | 99.249 |
| 936.0 | 96.463 |
| 935.0 | 99.633 |
| 934.0 | 98.491 |
| 933.0 | 97.365 |
| 932.0 | 93.992 |
| 931.0 | 94.249 |
| 930.0 | 99.773 |
| 929.0 | 98.049 |
| 928.0 | 99.681 |
| 927.0 | 94.817 |
| 926.0 | 95.33 |
| 925.0 | 99.358 |
| 924.0 | 98.414 |
| 923.0 | 99.185 |
| 922.0 | 99.063 |
| 921.0 | 95.908 |
| 920.0 | 98.462 |
| 919.0 | 99.254 |
| 918.0 | 98.785 |
| 917.0 | 99.906 |
| 916.0 | 98.284 |
| 915.0 | 95.811 |
| 914.0 | 97.541 |
| 913.0 | 96.999 |
| 912.0 | 95.803 |
| 911.0 | 98.986 |
| 910.0 | 98.789 |
| 909.0 | 99.478 |
| 908.0 | 99.837 |
| 907.0 | 99.283 |
| 906.0 | 98.843 |
| 905.0 | 98.4 |
| 904.0 | 97.271 |
| 903.0 | 99.186 |
| 902.0 | 99.543 |
| 901.0 | 97.485 |
| 900.0 | 93.988 |
| 899.0 | 97.612 |
| 898.0 | 99.703 |
| 897.0 | 98.879 |
| 896.0 | 99.549 |
| 895.0 | 99.938 |
| 894.0 | 97.049 |
| 893.0 | 91.557 |
| 892.0 | 94.51 |
| 891.0 | 98.969 |
| 890.0 | 98.9 |
| 889.0 | 99.73 |
| 888.0 | 99.852 |
| 887.0 | 98.561 |
| 886.0 | 97.589 |
| 885.0 | 96.878 |
| 884.0 | 96.176 |
| 883.0 | 99.052 |
| 882.0 | 99.803 |
| 881.0 | 99.239 |
| 880.0 | 98.478 |
| 879.0 | 97.507 |
| 878.0 | 98.798 |
| 877.0 | 99.591 |
| 876.0 | 98.467 |
| 875.0 | 95.173 |
| 874.0 | 97.219 |
| 873.0 | 98.886 |
| 872.0 | 98.173 |
| 871.0 | 98.898 |
| 870.0 | 99.464 |
| 869.0 | 99.639 |
| 868.0 | 96.067 |
| 867.0 | 94.832 |
| 866.0 | 97.126 |
| 865.0 | 99.052 |
| 864.0 | 99.793 |
| 863.0 | 99.329 |
| 862.0 | 99.173 |
| 861.0 | 99.096 |
| 860.0 | 98.5 |
| 859.0 | 98.682 |
| 858.0 | 98.69 |
| 857.0 | 99.155 |
| 856.0 | 99.374 |
| 855.0 | 99.553 |
| 854.0 | 98.759 |
| 853.0 | 99.334 |
| 852.0 | 99.453 |
| 851.0 | 99.086 |
| 850.0 | 99.635 |
| 849.0 | 99.429 |
| 848.0 | 98.93 |
| 847.0 | 98.705 |
| 846.0 | 98.795 |
| 845.0 | 98.674 |
| 844.0 | 98.979 |
| 843.0 | 98.999 |
| 842.0 | 99.23 |
| 841.0 | 99.576 |
| 840.0 | 98.954 |
| 839.0 | 98.969 |
| 838.0 | 99.281 |
| 837.0 | 98.706 |
| 836.0 | 98.935 |
| 835.0 | 98.895 |
| 834.0 | 98.773 |
| 833.0 | 98.913 |
| 832.0 | 98.763 |
| 831.0 | 98.962 |
| 830.0 | 99.219 |
| 829.0 | 99.115 |
| 828.0 | 98.838 |
| 827.0 | 98.407 |
| 826.0 | 98.306 |
| 825.0 | 98.6 |
| 824.0 | 99.223 |
| 823.0 | 99.885 |
| 822.0 | 99.888 |
| 821.0 | 99.354 |
| 820.0 | 98.255 |
| 819.0 | 97.977 |
| 818.0 | 98.692 |
| 817.0 | 99.148 |
| 816.0 | 99.194 |
| 815.0 | 99.271 |
| 814.0 | 99.574 |
| 813.0 | 98.679 |
| 812.0 | 99.011 |
| 811.0 | 99.615 |
| 810.0 | 99.606 |
| 809.0 | 99.332 |
| 808.0 | 99.313 |
| 807.0 | 99.42 |
| 806.0 | 99.238 |
| 805.0 | 99.029 |
| 804.0 | 99.148 |
| 803.0 | 99.028 |
| 802.0 | 98.917 |
| 801.0 | 99.079 |
| 800.0 | 99.254 |
| 799.0 | 99.078 |
| 798.0 | 99.122 |
| 797.0 | 99.107 |
| 796.0 | 99.039 |
| 795.0 | 99.081 |
| 794.0 | 99.074 |
| 793.0 | 99.022 |
| 792.0 | 99.044 |
| 791.0 | 99.008 |
| 790.0 | 98.966 |
| 789.0 | 99.019 |
| 788.0 | 99.088 |
| 787.0 | 99.09 |
| 786.0 | 99.161 |
| 785.0 | 99.17 |
| 784.0 | 99.09 |
| 783.0 | 99.152 |
| 782.0 | 99.217 |
| 781.0 | 98.878 |
| 780.0 | 96.491 |
| 779.0 | 90.761 |
| 778.0 | 87.205 |
| 777.0 | 87.994 |
| 776.0 | 86.475 |
| 775.0 | 83.895 |
| 774.0 | 80.498 |
| 773.0 | 76.642 |
| 772.0 | 76.636 |
| 771.0 | 76.376 |
| 770.0 | 73.183 |
| 769.0 | 64.672 |
| 768.0 | 59.227 |
| 767.0 | 56.962 |
| 766.0 | 50.236 |
| 765.0 | 50.82 |
| 764.0 | 52.649 |
| 763.0 | 53.084 |
| 762.0 | 52.162 |
| 761.0 | 50.266 |
| 760.0 | 51.377 |
| 759.0 | 50.903 |
| 758.0 | 50.44 |
| 757.0 | 51.834 |
| 756.0 | 48.956 |
| 755.0 | 44.806 |
| 754.0 | 39.768 |
| 753.0 | 34.397 |
| 752.0 | 31.424 |
| 751.0 | 28.974 |
| 750.0 | 25.95 |
| 749.0 | 22.26 |
| 748.0 | 19.916 |
| 747.0 | 18.46 |
| 746.0 | 17.775 |
| 745.0 | 18.007 |
| 744.0 | 18.205 |
| 743.0 | 18.734 |
| 742.0 | 17.151 |
| 741.0 | 13.822 |
| 740.0 | 10.577 |
| 739.0 | 8.717 |
| 738.0 | 8.558 |
| 737.0 | 8.417 |
| 736.0 | 7.313 |
| 735.0 | 6.089 |
| 734.0 | 5.544 |
| 733.0 | 5.184 |
| 732.0 | 3.904 |
| 731.0 | 2.693 |
| 730.0 | 2.819 |
| 729.0 | 3.435 |
| 728.0 | 3.002 |
| 727.0 | 1.812 |
| 726.0 | 1.075 |
| 725.0 | 0.762 |
| 724.0 | 0.498 |
| 723.0 | 0.346 |
| 722.0 | 0.232 |
| 721.0 | 0.11 |
| 720.0 | 0.044 |
| 719.0 | 0.018 |
| 718.0 | 0.006 |
| 717.0 | 0.001 |
| 716.0 | 0.003 |
| 715.0 | 0.004 |
| 714.0 | 0.003 |
| 713.0 | 0.002 |
| 712.0 | 0.006 |
| 711.0 | 0.005 |
| 710.0 | 0.002 |
| 709.0 | 0.005 |
| 708.0 | 0.003 |
| 707.0 | 0.001 |
| 706.0 | 0.006 |
| 705.0 | 0.004 |
| 704.0 | 0.006 |
| 703.0 | 0.003 |
| 702.0 | 0.002 |
| 701.0 | 0.001 |
| 700.0 | 0.005 |
| 699.0 | 0.004 |
| 698.0 | 0.005 |
| 697.0 | 0.004 |
| 696.0 | 0.002 |
| 695.0 | 0.001 |
| 694.0 | 0.006 |
| 693.0 | 0.004 |
| 692.0 | 0.006 |
| 691.0 | 0.005 |
| 690.0 | 0.002 |
| 689.0 | 0.004 |
| 688.0 | 0.005 |
| 687.0 | 0.005 |
| 686.0 | 0.005 |
| 685.0 | 0.003 |
| 684.0 | 0.003 |
| 683.0 | 0.001 |
| 682.0 | 0.007 |
| 681.0 | 0.006 |
| 680.0 | 0.006 |
| 679.0 | 0.004 |
| 678.0 | 0.002 |
| 677.0 | 0.003 |
| 676.0 | 0.006 |
| 675.0 | 0.004 |
| 674.0 | 0.008 |
| 673.0 | 0.005 |
| 672.0 | 0.004 |
| 671.0 | 0.002 |
| 670.0 | 0.007 |
| 669.0 | 0.005 |
| 668.0 | 0.005 |
| 667.0 | 0.003 |
| 666.0 | 0.003 |
| 665.0 | 0.001 |
| 664.0 | 0.007 |
| 663.0 | 0.006 |
| 662.0 | 0.006 |
| 661.0 | 0.006 |
| 660.0 | 0.002 |
| 659.0 | 0.003 |
| 658.0 | 0.007 |
| 657.0 | 0.006 |
| 656.0 | 0.007 |
| 655.0 | 0.006 |
| 654.0 | 0.003 |
| 653.0 | 0.002 |
| 652.0 | 0.005 |
| 651.0 | 0.006 |
| 650.0 | 0.006 |
| 649.0 | 0.006 |
| 648.0 | 0.002 |
| 647.0 | 0.003 |
| 646.0 | 0.005 |
| 645.0 | 0.005 |
| 644.0 | 0.007 |
| 643.0 | 0.007 |
| 642.0 | 0.002 |
| 641.0 | 0.004 |
| 640.0 | 0.006 |
| 639.0 | 0.008 |
| 638.0 | 0.005 |
| 637.0 | 0.005 |
| 636.0 | 0.002 |
| 635.0 | 0.003 |
| 634.0 | 0.005 |
| 633.0 | 0.006 |
| 632.0 | 0.006 |
| 631.0 | 0.006 |
| 630.0 | 0.001 |
| 629.0 | 0.004 |
| 628.0 | 0.005 |
| 627.0 | 0.006 |
| 626.0 | 0.005 |
| 625.0 | 0.007 |
| 624.0 | 0.002 |
| 623.0 | 0.004 |
| 622.0 | 0.006 |
| 621.0 | 0.006 |
| 620.0 | 0.006 |
| 619.0 | 0.007 |
| 618.0 | 0.003 |
| 617.0 | 0.005 |
| 616.0 | 0.006 |
| 615.0 | 0.006 |
| 614.0 | 0.006 |
| 613.0 | 0.005 |
| 612.0 | 0.002 |
| 611.0 | 0.003 |
| 610.0 | 0.006 |
| 609.0 | 0.007 |
| 608.0 | 0.008 |
| 607.0 | 0.006 |
| 606.0 | 0.003 |
| 605.0 | 0.003 |
| 604.0 | 0.006 |
| 603.0 | 0.006 |
| 602.0 | 0.007 |
| 601.0 | 0.006 |
| 600.0 | 0.003 |
| 599.0 | 0.004 |
| 598.0 | 0.006 |
| 597.0 | 0.005 |
| 596.0 | 0.004 |
| 595.0 | 0.006 |
| 594.0 | 0.003 |
| 593.0 | 0.004 |
| 592.0 | 0.006 |
| 591.0 | 0.007 |
| 590.0 | 0.007 |
| 589.0 | 0.006 |
| 588.0 | 0.003 |
| 587.0 | 0.002 |
| 586.0 | 0.006 |
| 585.0 | 0.006 |
| 584.0 | 0.005 |
| 583.0 | 0.006 |
| 582.0 | 0.003 |
| 581.0 | 0.003 |
| 580.0 | 0.006 |
| 579.0 | 0.007 |
| 578.0 | 0.007 |
| 577.0 | 0.005 |
| 576.0 | 0.004 |
| 575.0 | 0.003 |
| 574.0 | 0.008 |
| 573.0 | 0.007 |
| 572.0 | 0.007 |
| 571.0 | 0.005 |
| 570.0 | 0.003 |
| 569.0 | 0.003 |
| 568.0 | 0.006 |
| 567.0 | 0.006 |
| 566.0 | 0.005 |
| 565.0 | 0.006 |
| 564.0 | 0.003 |
| 563.0 | 0.004 |
| 562.0 | 0.007 |
| 561.0 | 0.007 |
| 560.0 | 0.006 |
| 559.0 | 0.005 |
| 558.0 | 0.007 |
| 557.0 | 0.005 |
| 556.0 | 0.003 |
| 555.0 | 0.004 |
| 554.0 | 0.007 |
| 553.0 | 0.005 |
| 552.0 | 0.005 |
| 551.0 | 0.004 |
| 550.0 | 0.003 |
| 549.0 | 0.004 |
| 548.0 | 0.007 |
| 547.0 | 0.007 |
| 546.0 | 0.007 |
| 545.0 | 0.006 |
| 544.0 | 0.004 |
| 543.0 | 0.005 |
| 542.0 | 0.007 |
| 541.0 | 0.006 |
| 540.0 | 0.007 |
| 539.0 | 0.006 |
| 538.0 | 0.003 |
| 537.0 | 0.004 |
| 536.0 | 0.007 |
| 535.0 | 0.007 |
| 534.0 | 0.008 |
| 533.0 | 0.006 |
| 532.0 | 0.003 |
| 531.0 | 0.004 |
| 530.0 | 0.006 |
| 529.0 | 0.007 |
| 528.0 | 0.007 |
| 527.0 | 0.006 |
| 526.0 | 0.003 |
| 525.0 | 0.005 |
| 524.0 | 0.007 |
| 523.0 | 0.007 |
| 522.0 | 0.006 |
| 521.0 | 0.005 |
| 520.0 | 0.003 |
| 519.0 | 0.004 |
| 518.0 | 0.003 |
| 517.0 | 0.005 |
| 516.0 | 0.014 |
| 515.0 | 0.013 |
| 514.0 | 0.01 |
| 513.0 | 0.005 |
| 512.0 | 0.001 |
| 511.0 | 0.003 |
| 510.0 | 0.019 |
| 509.0 | 0.125 |
| 508.0 | 0.436 |
| 507.0 | 0.802 |
| 506.0 | 0.86 |
| 505.0 | 0.611 |
| 504.0 | 0.509 |
| 503.0 | 0.72 |
| 502.0 | 0.846 |
| 501.0 | 0.631 |
| 500.0 | 0.328 |
| 499.0 | 0.207 |
| 498.0 | 0.296 |
| 497.0 | 0.467 |
| 496.0 | 0.53 |
| 495.0 | 0.44 |
| 494.0 | 0.289 |
| 493.0 | 0.163 |
| 492.0 | 0.1 |
| 491.0 | 0.091 |
| 490.0 | 0.145 |
| 489.0 | 0.368 |
| 488.0 | 0.696 |
| 487.0 | 0.795 |
| 486.0 | 0.639 |
| 485.0 | 0.624 |
| 484.0 | 0.803 |
| 483.0 | 0.797 |
| 482.0 | 0.679 |
| 481.0 | 0.858 |
| 480.0 | 1.157 |
| 479.0 | 1.069 |
| 478.0 | 0.718 |
| 477.0 | 0.66 |
| 476.0 | 1.226 |
| 475.0 | 2.294 |
| 474.0 | 3.176 |
| 473.0 | 3.327 |
| 472.0 | 3.33 |
| 471.0 | 4.177 |
| 470.0 | 5.346 |
| 469.0 | 5.006 |
| 468.0 | 3.044 |
| 467.0 | 1.466 |
| 466.0 | 1.292 |
| 465.0 | 1.96 |
| 464.0 | 2.744 |
| 463.0 | 3.054 |
| 462.0 | 2.802 |
| 461.0 | 2.282 |
| 460.0 | 1.69 |
| 459.0 | 1.135 |
| 458.0 | 0.622 |
| 457.0 | 0.253 |
| 456.0 | 0.129 |
| 455.0 | 0.119 |
| 454.0 | 0.09 |
| 453.0 | 0.037 |
| 452.0 | 0.002 |
| 451.0 | 0.006 |
| 450.0 | 0.006 |
| 449.0 | 0.003 |
| 448.0 | 0 |
| 447.0 | 0.003 |
| 446.0 | 0.005 |
| 445.0 | 0.005 |
| 444.0 | 0.006 |
| 443.0 | 0.004 |
| 442.0 | 0.003 |
| 441.0 | 0.006 |
| 440.0 | 0.007 |
| 439.0 | 0.006 |
| 438.0 | 0.007 |
| 437.0 | 0.005 |
| 436.0 | 0.002 |
| 435.0 | 0.005 |
| 434.0 | 0.006 |
| 433.0 | 0.006 |
| 432.0 | 0.007 |
| 431.0 | 0.004 |
| 430.0 | 0.003 |
| 429.0 | 0.004 |
| 428.0 | 0.005 |
| 427.0 | 0.005 |
| 426.0 | 0.005 |
| 425.0 | 0 |
| 424.0 | 0.023 |
| 423.0 | 0.047 |
| 422.0 | 0.037 |
| 421.0 | 0.011 |
| 420.0 | 0.004 |
| 419.0 | 0.015 |
| 418.0 | 0.152 |
| 417.0 | 0.3 |
| 416.0 | 0.251 |
| 415.0 | 0.12 |
| 414.0 | 0.063 |
| 413.0 | 0.063 |
| 412.0 | 0.093 |
| 411.0 | 0.116 |
| 410.0 | 0.078 |
| 409.0 | 0.061 |
| 408.0 | 0.094 |
| 407.0 | 0.092 |
| 406.0 | 0.053 |
| 405.0 | 0.037 |
| 404.0 | 0.043 |
| 403.0 | 0.046 |
| 402.0 | 0.212 |
| 401.0 | 0.498 |
| 400.0 | 0.743 |
| 399.0 | 0.773 |
| 398.0 | 0.509 |
| 397.0 | 0.22 |
| 396.0 | 0.132 |
| 395.0 | 0.127 |
| 394.0 | 0.136 |
| 393.0 | 0.498 |
| 392.0 | 1.005 |
| 391.0 | 0.973 |
| 390.0 | 0.722 |
| 389.0 | 0.716 |
| 388.0 | 0.641 |
| 387.0 | 0.583 |
| 386.0 | 1.261 |
| 385.0 | 2.58 |
| 384.0 | 3.334 |
| 383.0 | 3.127 |
| 382.0 | 2.294 |
| 381.0 | 1.262 |
| 380.0 | 1.248 |
| 379.0 | 2.435 |
| 378.0 | 4.298 |
| 377.0 | 5.565 |
| 376.0 | 4.855 |
| 375.0 | 2.74 |
| 374.0 | 1.163 |
| 373.0 | 0.493 |
| 372.0 | 0.182 |
| 371.0 | 0.043 |
| 370.0 | 0.003 |
| 369.0 | 0.002 |
| 368.0 | 0.003 |
| 367.0 | 0 |
| 366.0 | 0.001 |
| 365.0 | 0.005 |
| 364.0 | 0.004 |
| 363.0 | 0.006 |
| 362.0 | 0.006 |
| 361.0 | 0.003 |
| 360.0 | 0.002 |
| 359.0 | 0.005 |
| 358.0 | 0.006 |
| 357.0 | 0.004 |
| 356.0 | 0.005 |
| 355.0 | 0.003 |
| 354.0 | 0.002 |
| 353.0 | 0.006 |
| 352.0 | 0.007 |
| 351.0 | 0.005 |
| 350.0 | 0.005 |
| 349.0 | 0.003 |
| 348.0 | 0.002 |
| 347.0 | 0.006 |
| 346.0 | 0.006 |
| 345.0 | 0.007 |
| 344.0 | 0.005 |
| 343.0 | 0.004 |
| 342.0 | 0.002 |
| 341.0 | 0.006 |
| 340.0 | 0.007 |
| 339.0 | 0.004 |
| 338.0 | 0.006 |
| 337.0 | 0.004 |
| 336.0 | 0.002 |
| 335.0 | 0.007 |
| 334.0 | 0.006 |
| 333.0 | 0.007 |
| 332.0 | 0.005 |
| 331.0 | 0.002 |
| 330.0 | 0.002 |
| 329.0 | 0.006 |
| 328.0 | 0.007 |
| 327.0 | 0.003 |
| 326.0 | 0.005 |
| 325.0 | 0.003 |
| 324.0 | 0.003 |
| 323.0 | 0.006 |
| 322.0 | 0.007 |
| 321.0 | 0.003 |
| 320.0 | 0.006 |
| 319.0 | 0.002 |
| 318.0 | 0.006 |
| 317.0 | 0.006 |
| 316.0 | 0.004 |
| 315.0 | 0.006 |
| 314.0 | 0.005 |
| 313.0 | 0.002 |
| 312.0 | 0.001 |
| 311.0 | 0.005 |
| 310.0 | 0.006 |
| 309.0 | 0.006 |
| 308.0 | 0.005 |
| 307.0 | 0.002 |
| 306.0 | 0.002 |
| 305.0 | 0.005 |
| 304.0 | 0.005 |
| 303.0 | 0.003 |
| 302.0 | 0.005 |
| 301.0 | 0.003 |
| 300.0 | 0.001 |
| 299.0 | 0.005 |
| 298.0 | 0.006 |
| 297.0 | 0.005 |
| 296.0 | 0.005 |
| 295.0 | 0.003 |
| 294.0 | 0 |
| 293.0 | 0.006 |
| 292.0 | 0.005 |
| 291.0 | 0.003 |
| 290.0 | 0.005 |
| 289.0 | 0.002 |
| 288.0 | 0.001 |
| 287.0 | 0.006 |
| 286.0 | 0.006 |
| 285.0 | 0.008 |
| 284.0 | 0.005 |
| 283.0 | 0.003 |
| 282.0 | 0.001 |
| 281.0 | 0.006 |
| 280.0 | 0.005 |
| 279.0 | 0.006 |
| 278.0 | 0.007 |
| 277.0 | 0.002 |
| 276.0 | 0.001 |
| 275.0 | 0.007 |
| 274.0 | 0.006 |
| 273.0 | 0.006 |
| 272.0 | 0.005 |
| 271.0 | 0.001 |
| 270.0 | 0.002 |
| 269.0 | 0.006 |
| 268.0 | 0.007 |
| 267.0 | 0.003 |
| 266.0 | 0.003 |
| 265.0 | 0.001 |
| 264.0 | 0.002 |
| 263.0 | 0.006 |
| 262.0 | 0.007 |
| 261.0 | 0.004 |
| 260.0 | 0.007 |
| 259.0 | 0.002 |
| 258.0 | 0.003 |
| 257.0 | 0.006 |
| 256.0 | 0.007 |
| 255.0 | 0.004 |
| 254.0 | 0.007 |
| 253.0 | 0.001 |
| 252.0 | 0.003 |
| 251.0 | 0.005 |
| 250.0 | 0.007 |
| 249.0 | 0.003 |
| 248.0 | 0.008 |
| 247.0 | 0.002 |
| 246.0 | 0.002 |
| 245.0 | 0.006 |
| 244.0 | 0.006 |
| 243.0 | 0.006 |
| 242.0 | 0.007 |
| 241.0 | 0.001 |
| 240.0 | 0.004 |
| 239.0 | 0.006 |
| 238.0 | 0.009 |
| 237.0 | 0.003 |
| 236.0 | 0.008 |
| 235.0 | 0.002 |
| 234.0 | 0.003 |
| 233.0 | 0.007 |
| 232.0 | 0.007 |
| 231.0 | 0.004 |
| 230.0 | 0.007 |
| 229.0 | 0.001 |
| 228.0 | 0.003 |
| 227.0 | 0.007 |
| 226.0 | 0.007 |
| 225.0 | 0.007 |
| 224.0 | 0.006 |
| 223.0 | 0.002 |
| 222.0 | 0.004 |
| 221.0 | 0.007 |
| 220.0 | 0.008 |
| 219.0 | 0.005 |
| 218.0 | 0.006 |
| 217.0 | 0.003 |
| 216.0 | 0.004 |
| 215.0 | 0.008 |
| 214.0 | 0.008 |
| 213.0 | 0.009 |
| 212.0 | 0.007 |
| 211.0 | 0.005 |
| 210.0 | 0.005 |
| 209.0 | 0.008 |
| 208.0 | 0.008 |
| 207.0 | 0.006 |
| 206.0 | 0.008 |
| 205.0 | 0.006 |
| 204.0 | 0.006 |
| 203.0 | 0.012 |
| 202.0 | 0.012 |
| 201.0 | 0.015 |
| 200.0 | 0.014 |